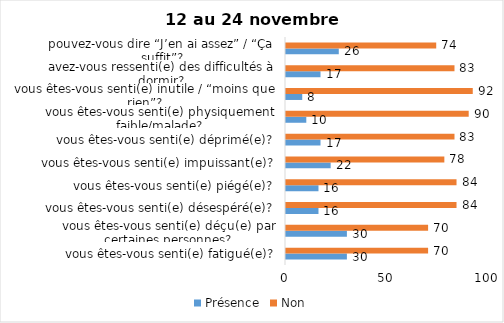
| Category | Présence | Non |
|---|---|---|
| vous êtes-vous senti(e) fatigué(e)? | 30 | 70 |
| vous êtes-vous senti(e) déçu(e) par certaines personnes? | 30 | 70 |
| vous êtes-vous senti(e) désespéré(e)? | 16 | 84 |
| vous êtes-vous senti(e) piégé(e)? | 16 | 84 |
| vous êtes-vous senti(e) impuissant(e)? | 22 | 78 |
| vous êtes-vous senti(e) déprimé(e)? | 17 | 83 |
| vous êtes-vous senti(e) physiquement faible/malade? | 10 | 90 |
| vous êtes-vous senti(e) inutile / “moins que rien”? | 8 | 92 |
| avez-vous ressenti(e) des difficultés à dormir? | 17 | 83 |
| pouvez-vous dire “J’en ai assez” / “Ça suffit”? | 26 | 74 |